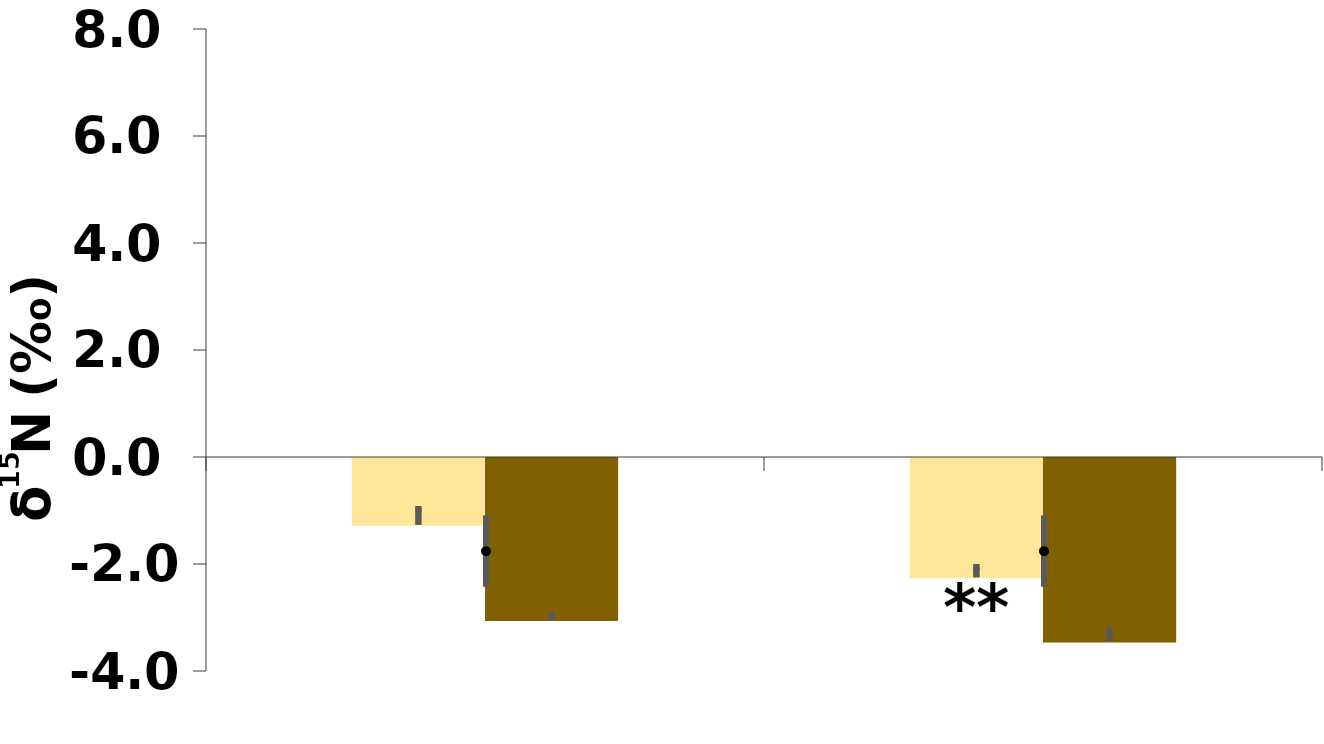
| Category | Root | Shoot |
|---|---|---|
| 0.0 | -1.266 | -3.049 |
| 0.0 | -2.248 | -3.448 |